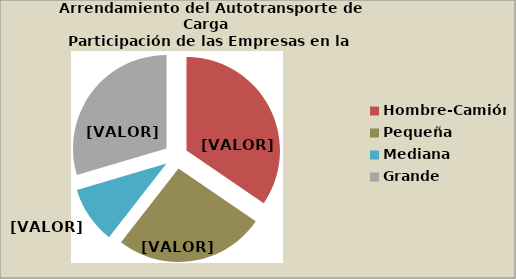
| Category | Series 0 |
|---|---|
| Hombre-Camión | 34.507 |
| Pequeña | 26 |
| Mediana | 9.859 |
| Grande | 29.577 |